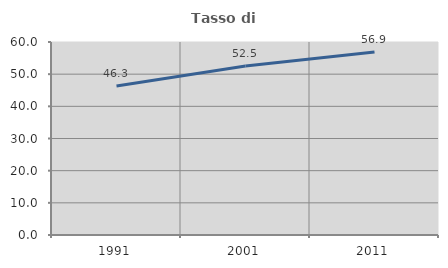
| Category | Tasso di occupazione   |
|---|---|
| 1991.0 | 46.341 |
| 2001.0 | 52.516 |
| 2011.0 | 56.874 |